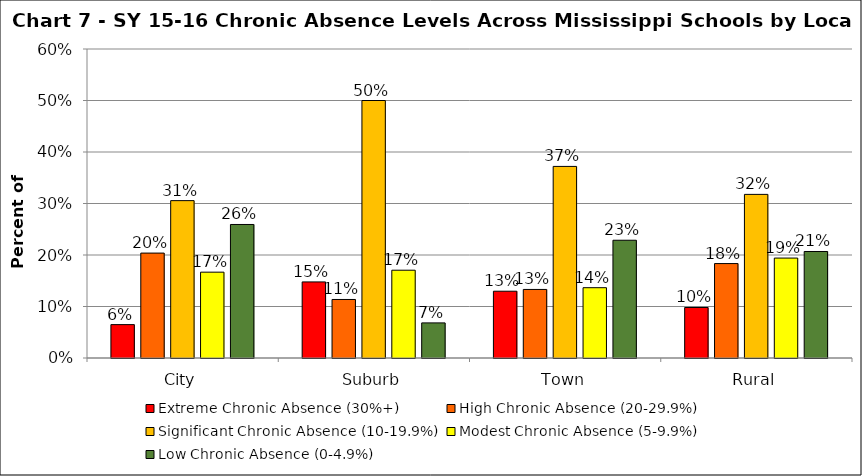
| Category | Extreme Chronic Absence (30%+) | High Chronic Absence (20-29.9%) | Significant Chronic Absence (10-19.9%) | Modest Chronic Absence (5-9.9%) | Low Chronic Absence (0-4.9%) |
|---|---|---|---|---|---|
| 0 | 0.065 | 0.204 | 0.306 | 0.167 | 0.259 |
| 1 | 0.148 | 0.114 | 0.5 | 0.17 | 0.068 |
| 2 | 0.13 | 0.133 | 0.372 | 0.137 | 0.229 |
| 3 | 0.098 | 0.183 | 0.318 | 0.194 | 0.207 |